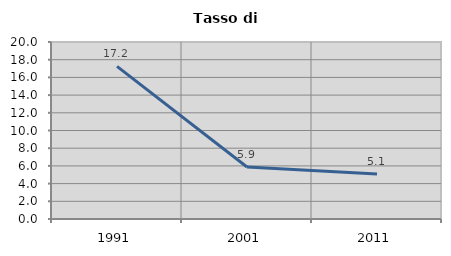
| Category | Tasso di disoccupazione   |
|---|---|
| 1991.0 | 17.241 |
| 2001.0 | 5.882 |
| 2011.0 | 5.085 |